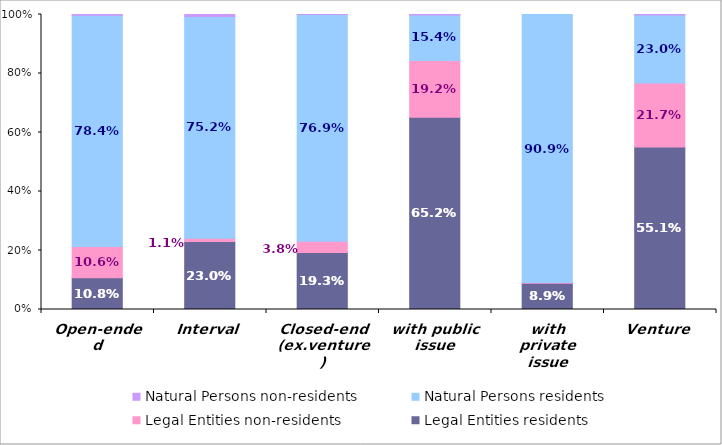
| Category | Legal Entities | Natural Persons |
|---|---|---|
| Open-ended | 0.106 | 0.003 |
| Interval | 0.011 | 0.007 |
| Closed-end (ex.venture) | 0.038 | 0 |
| with public issue | 0.192 | 0.002 |
| with private issue | 0.002 | 0 |
| Venture | 0.217 | 0.002 |